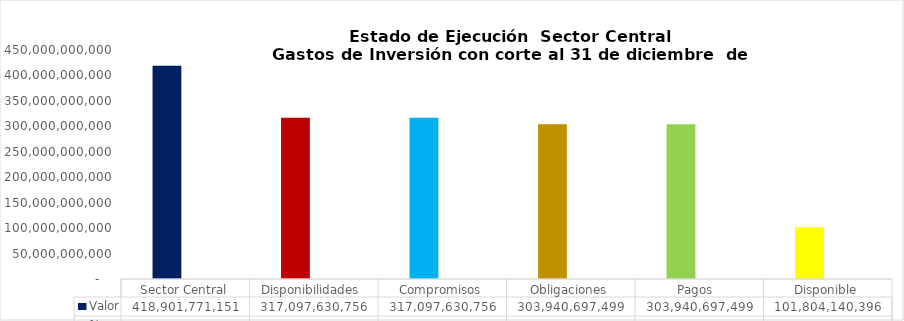
| Category | Valor | % |
|---|---|---|
| Sector Central | 418901771151.37 | 1 |
| Disponibilidades  | 317097630755.74 | 0.757 |
| Compromisos | 317097630755.74 | 0.757 |
| Obligaciones | 303940697499.46 | 0.726 |
| Pagos  | 303940697499.46 | 0.726 |
| Disponible | 101804140395.63 | 0.243 |